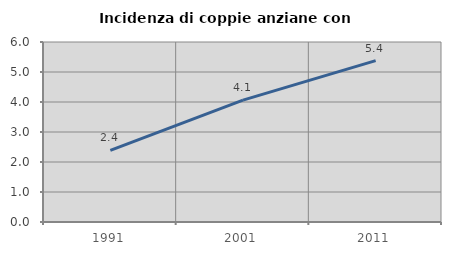
| Category | Incidenza di coppie anziane con figli |
|---|---|
| 1991.0 | 2.387 |
| 2001.0 | 4.064 |
| 2011.0 | 5.38 |